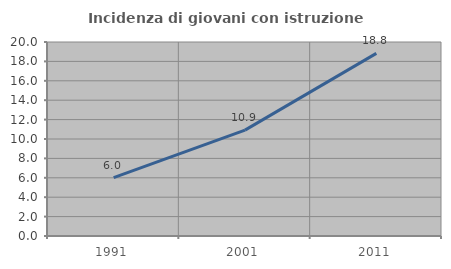
| Category | Incidenza di giovani con istruzione universitaria |
|---|---|
| 1991.0 | 6.009 |
| 2001.0 | 10.913 |
| 2011.0 | 18.83 |